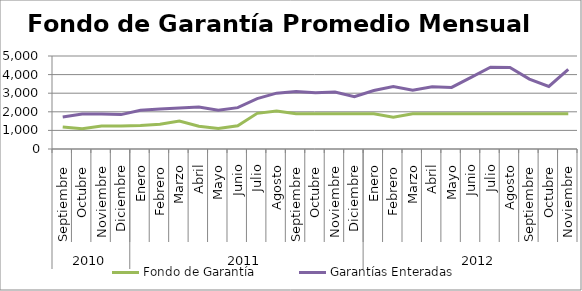
| Category | Fondo de Garantía | Garantías Enteradas |
|---|---|---|
| 0 | 1186.765 | 1723.136 |
| 1 | 1091.277 | 1878.561 |
| 2 | 1240.142 | 1886.493 |
| 3 | 1233.184 | 1848.941 |
| 4 | 1267.175 | 2079.773 |
| 5 | 1328.315 | 2151.804 |
| 6 | 1507.218 | 2200.488 |
| 7 | 1222.61 | 2253.818 |
| 8 | 1097.438 | 2081.441 |
| 9 | 1248.758 | 2223.666 |
| 10 | 1917.982 | 2706.525 |
| 11 | 2038.339 | 3002.384 |
| 12 | 1900.513 | 3095.395 |
| 13 | 1900.513 | 3029.373 |
| 14 | 1900.513 | 3060.179 |
| 15 | 1900.513 | 2809.042 |
| 16 | 1896.798 | 3141.641 |
| 17 | 1714.423 | 3362.648 |
| 18 | 1900.513 | 3154.118 |
| 19 | 1900.513 | 3348.058 |
| 20 | 1898.685 | 3308.859 |
| 21 | 1900.513 | 3850.375 |
| 22 | 1900.513 | 4400.539 |
| 23 | 1895.388 | 4383.327 |
| 24 | 1900.513 | 3757.632 |
| 25 | 1900.513 | 3362.932 |
| 26 | 1900.311 | 4285.609 |